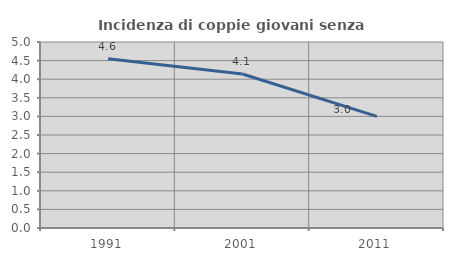
| Category | Incidenza di coppie giovani senza figli |
|---|---|
| 1991.0 | 4.551 |
| 2001.0 | 4.141 |
| 2011.0 | 2.999 |